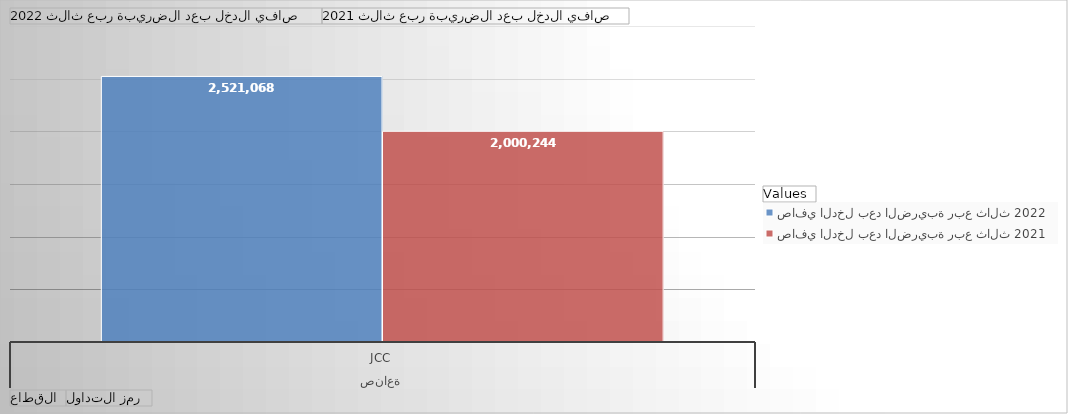
| Category | صافي الدخل بعد الضريبة ربع ثالث 2022  | صافي الدخل بعد الضريبة ربع ثالث 2021 |
|---|---|---|
| 0 | 2521068 | 2000244 |